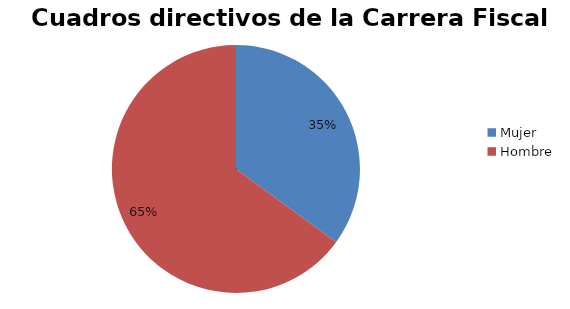
| Category | Series 0 |
|---|---|
| Mujer | 41 |
| Hombre | 76 |